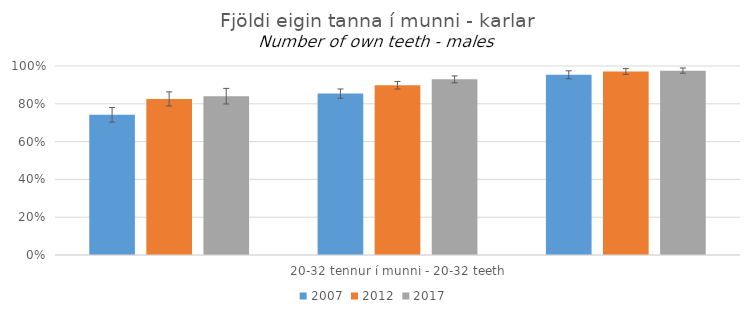
| Category | 2007 | 2012 | 2017 |
|---|---|---|---|
| 0 | 0.742 | 0.826 | 0.84 |
| 1 | 0.854 | 0.898 | 0.929 |
| 2 | 0.954 | 0.971 | 0.975 |